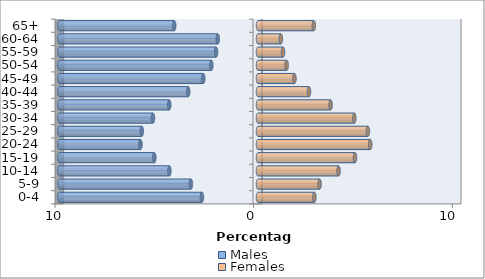
| Category | Males | Females |
|---|---|---|
| 0-4 | -2.823 | 2.837 |
| 5-9 | -3.378 | 3.101 |
| 10-14 | -4.462 | 4.056 |
| 15-19 | -5.22 | 4.882 |
| 20-24 | -5.917 | 5.647 |
| 25-29 | -5.85 | 5.531 |
| 30-34 | -5.288 | 4.848 |
| 35-39 | -4.469 | 3.656 |
| 40-44 | -3.514 | 2.566 |
| 45-49 | -2.756 | 1.835 |
| 50-54 | -2.349 | 1.442 |
| 55-59 | -2.112 | 1.259 |
| 60-64 | -2.024 | 1.151 |
| 65+ | -4.218 | 2.81 |